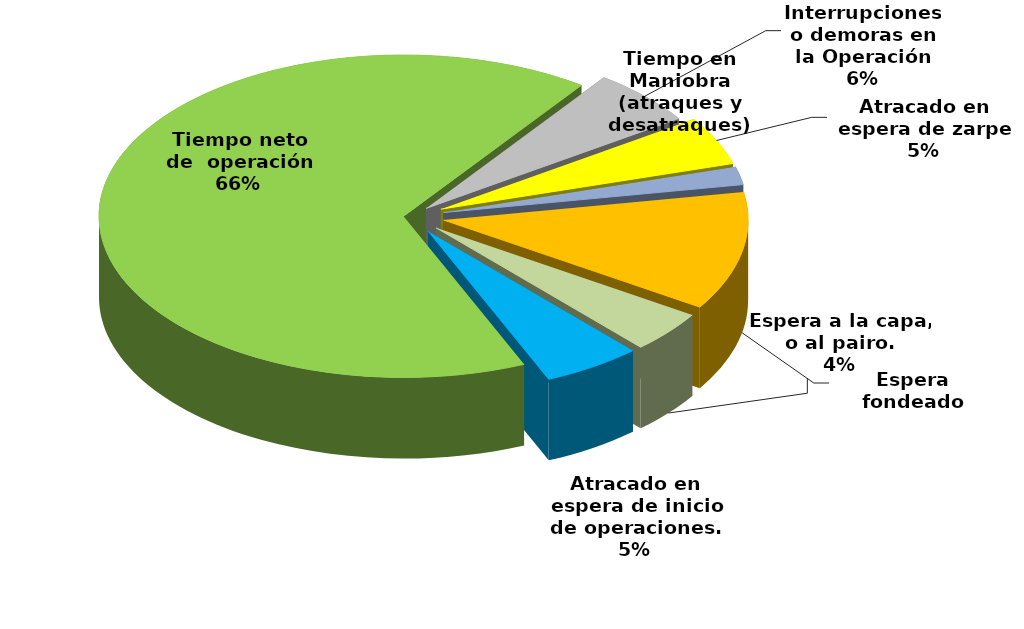
| Category | Series 0 |
|---|---|
| Espera fondeado | 12949.41 |
| Espera a la capa, o al pairo. | 4571.35 |
| Atracado en espera de inicio de operaciones. | 5735.565 |
| Tiempo neto de  operación | 72482.192 |
| Interrupciones o demoras en la Operación | 6176.58 |
| Atracado en espera de zarpe | 5294.052 |
| Tiempo en Maniobra (atraques y desatraques) | 1958.75 |